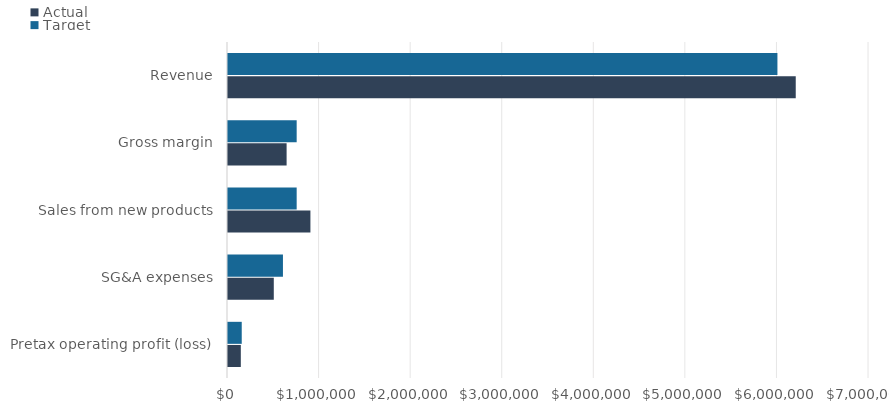
| Category | Actual | Target |
|---|---|---|
| Pretax operating profit (loss) | 140000 | 150000 |
| SG&A expenses | 500000 | 600000 |
| Sales from new products | 900000 | 750000 |
| Gross margin | 640000 | 750000 |
| Revenue | 6200000 | 6000000 |